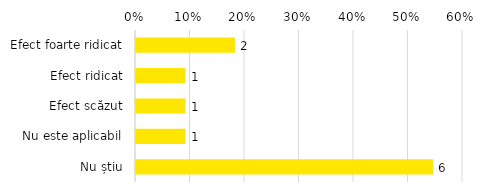
| Category | Total |
|---|---|
| Efect foarte ridicat | 0.182 |
| Efect ridicat | 0.091 |
| Efect scăzut | 0.091 |
| Nu este aplicabil | 0.091 |
| Nu știu | 0.545 |